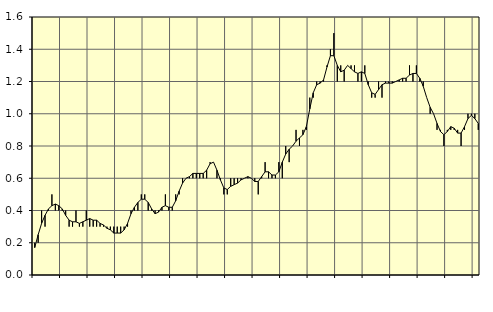
| Category | Piggar | Fast anställda utomlands |
|---|---|---|
| nan | 0.2 | 0.17 |
| 87.0 | 0.2 | 0.25 |
| 87.0 | 0.4 | 0.32 |
| 87.0 | 0.3 | 0.37 |
| nan | 0.4 | 0.41 |
| 88.0 | 0.5 | 0.43 |
| 88.0 | 0.4 | 0.44 |
| 88.0 | 0.4 | 0.43 |
| nan | 0.4 | 0.41 |
| 89.0 | 0.4 | 0.37 |
| 89.0 | 0.3 | 0.34 |
| 89.0 | 0.3 | 0.33 |
| nan | 0.4 | 0.33 |
| 90.0 | 0.3 | 0.32 |
| 90.0 | 0.3 | 0.33 |
| 90.0 | 0.4 | 0.34 |
| nan | 0.3 | 0.35 |
| 91.0 | 0.3 | 0.34 |
| 91.0 | 0.3 | 0.34 |
| 91.0 | 0.3 | 0.32 |
| nan | 0.3 | 0.31 |
| 92.0 | 0.3 | 0.29 |
| 92.0 | 0.3 | 0.28 |
| 92.0 | 0.3 | 0.26 |
| nan | 0.3 | 0.26 |
| 93.0 | 0.3 | 0.26 |
| 93.0 | 0.3 | 0.28 |
| 93.0 | 0.3 | 0.32 |
| nan | 0.4 | 0.38 |
| 94.0 | 0.4 | 0.42 |
| 94.0 | 0.4 | 0.45 |
| 94.0 | 0.5 | 0.47 |
| nan | 0.5 | 0.47 |
| 95.0 | 0.4 | 0.45 |
| 95.0 | 0.4 | 0.41 |
| 95.0 | 0.4 | 0.38 |
| nan | 0.4 | 0.39 |
| 96.0 | 0.4 | 0.42 |
| 96.0 | 0.5 | 0.43 |
| 96.0 | 0.4 | 0.42 |
| nan | 0.4 | 0.42 |
| 97.0 | 0.5 | 0.46 |
| 97.0 | 0.5 | 0.52 |
| 97.0 | 0.6 | 0.57 |
| nan | 0.6 | 0.6 |
| 98.0 | 0.6 | 0.61 |
| 98.0 | 0.6 | 0.63 |
| 98.0 | 0.6 | 0.63 |
| nan | 0.6 | 0.63 |
| 99.0 | 0.6 | 0.63 |
| 99.0 | 0.6 | 0.65 |
| 99.0 | 0.7 | 0.69 |
| nan | 0.7 | 0.7 |
| 0.0 | 0.6 | 0.65 |
| 0.0 | 0.6 | 0.59 |
| 0.0 | 0.5 | 0.54 |
| nan | 0.5 | 0.53 |
| 1.0 | 0.6 | 0.55 |
| 1.0 | 0.6 | 0.56 |
| 1.0 | 0.6 | 0.57 |
| nan | 0.6 | 0.59 |
| 2.0 | 0.6 | 0.6 |
| 2.0 | 0.6 | 0.61 |
| 2.0 | 0.6 | 0.6 |
| nan | 0.6 | 0.58 |
| 3.0 | 0.5 | 0.58 |
| 3.0 | 0.6 | 0.61 |
| 3.0 | 0.7 | 0.64 |
| nan | 0.6 | 0.64 |
| 4.0 | 0.6 | 0.62 |
| 4.0 | 0.6 | 0.62 |
| 4.0 | 0.7 | 0.64 |
| nan | 0.6 | 0.7 |
| 5.0 | 0.8 | 0.75 |
| 5.0 | 0.7 | 0.78 |
| 5.0 | 0.8 | 0.8 |
| nan | 0.9 | 0.83 |
| 6.0 | 0.8 | 0.85 |
| 6.0 | 0.9 | 0.87 |
| 6.0 | 0.9 | 0.92 |
| nan | 1.1 | 1.03 |
| 7.0 | 1.1 | 1.13 |
| 7.0 | 1.2 | 1.18 |
| 7.0 | 1.2 | 1.19 |
| nan | 1.2 | 1.21 |
| 8.0 | 1.3 | 1.29 |
| 8.0 | 1.4 | 1.36 |
| 8.0 | 1.5 | 1.36 |
| nan | 1.2 | 1.3 |
| 9.0 | 1.3 | 1.26 |
| 9.0 | 1.2 | 1.27 |
| 9.0 | 1.3 | 1.3 |
| nan | 1.3 | 1.28 |
| 10.0 | 1.3 | 1.26 |
| 10.0 | 1.2 | 1.25 |
| 10.0 | 1.2 | 1.26 |
| nan | 1.3 | 1.25 |
| 11.0 | 1.2 | 1.18 |
| 11.0 | 1.1 | 1.13 |
| 11.0 | 1.1 | 1.12 |
| nan | 1.2 | 1.15 |
| 12.0 | 1.1 | 1.18 |
| 12.0 | 1.2 | 1.19 |
| 12.0 | 1.2 | 1.19 |
| nan | 1.2 | 1.19 |
| 13.0 | 1.2 | 1.2 |
| 13.0 | 1.2 | 1.21 |
| 13.0 | 1.2 | 1.22 |
| nan | 1.2 | 1.22 |
| 14.0 | 1.3 | 1.24 |
| 14.0 | 1.2 | 1.25 |
| 14.0 | 1.3 | 1.25 |
| nan | 1.2 | 1.22 |
| 15.0 | 1.2 | 1.17 |
| 15.0 | 1.1 | 1.1 |
| 15.0 | 1 | 1.04 |
| nan | 1 | 1 |
| 16.0 | 0.9 | 0.94 |
| 16.0 | 0.9 | 0.89 |
| 16.0 | 0.8 | 0.87 |
| nan | 0.9 | 0.89 |
| 17.0 | 0.9 | 0.92 |
| 17.0 | 0.9 | 0.91 |
| 17.0 | 0.9 | 0.88 |
| nan | 0.8 | 0.88 |
| 18.0 | 0.9 | 0.92 |
| 18.0 | 1 | 0.97 |
| 18.0 | 1 | 0.99 |
| nan | 1 | 0.97 |
| 19.0 | 0.9 | 0.94 |